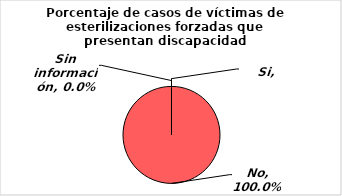
| Category | Series 0 |
|---|---|
| Si | 0 |
| No | 1 |
| Sin información | 0 |